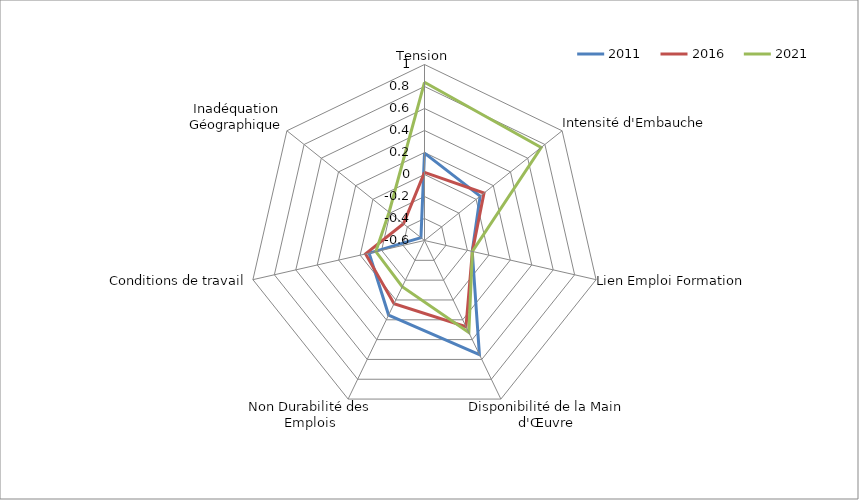
| Category | 2011 | 2016 | 2021 |
|---|---|---|---|
| Tension | 0.195 | 0.019 | 0.838 |
| Intensité d'Embauche | 0.047 | 0.092 | 0.756 |
| Lien Emploi Formation | -0.155 | -0.154 | -0.154 |
| Disponibilité de la Main d'Œuvre | 0.551 | 0.269 | 0.329 |
| Non Durabilité des Emplois | 0.152 | 0.038 | -0.133 |
| Conditions de travail | -0.084 | -0.05 | -0.146 |
| Inadéquation Géographique | -0.559 | -0.355 | -0.188 |